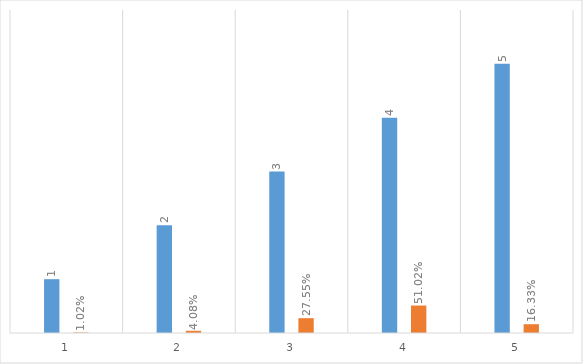
| Category | Series 0 | Series 1 |
|---|---|---|
| 0 | 1 | 0.01 |
| 1 | 2 | 0.041 |
| 2 | 3 | 0.276 |
| 3 | 4 | 0.51 |
| 4 | 5 | 0.163 |